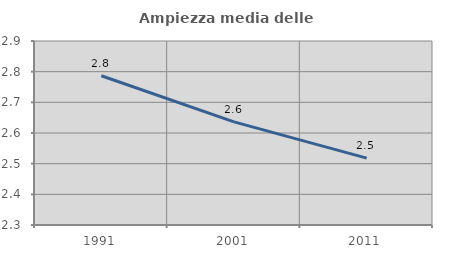
| Category | Ampiezza media delle famiglie |
|---|---|
| 1991.0 | 2.787 |
| 2001.0 | 2.636 |
| 2011.0 | 2.518 |